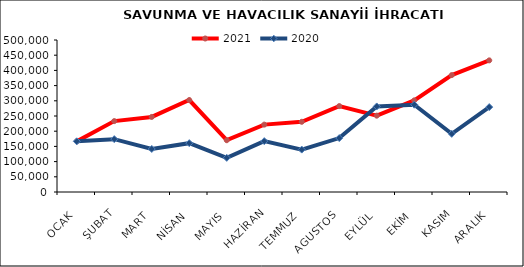
| Category | 2021 | 2020 |
|---|---|---|
| OCAK | 166540.168 | 166806.051 |
| ŞUBAT | 233224.164 | 173864.446 |
| MART | 246958.497 | 141493.826 |
| NİSAN | 302515.378 | 160660.437 |
| MAYIS | 170344.528 | 112401.962 |
| HAZİRAN | 221630.073 | 167254.757 |
| TEMMUZ | 230940.866 | 139464.13 |
| AGUSTOS | 282583.169 | 177409.444 |
| EYLÜL | 251131.337 | 281441.778 |
| EKİM | 301391.63 | 287144.696 |
| KASIM | 384516.491 | 191364.258 |
| ARALIK | 433009.342 | 279389.432 |